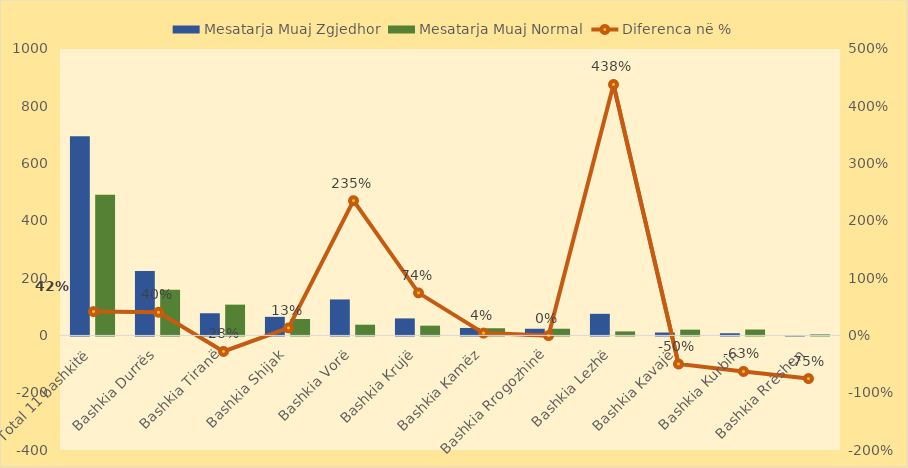
| Category | Mesatarja Muaj Zgjedhor | Mesatarja Muaj Normal |
|---|---|---|
| Total 11 bashkitë | 695.501 | 491.096 |
| Bashkia Durrës | 224.52 | 159.885 |
| Bashkia Tiranë | 77.421 | 107.494 |
| Bashkia Shijak | 64.91 | 57.422 |
| Bashkia Vorë | 125.625 | 37.476 |
| Bashkia Krujë | 59.441 | 34.107 |
| Bashkia Kamëz | 26.14 | 25.112 |
| Bashkia Rrogozhinë | 23.3 | 23.376 |
| Bashkia Lezhë | 75.522 | 14.036 |
| Bashkia Kavajë | 10.134 | 20.207 |
| Bashkia Kurbin | 7.651 | 20.618 |
| Bashkia Rrëshen | 0.924 | 3.751 |